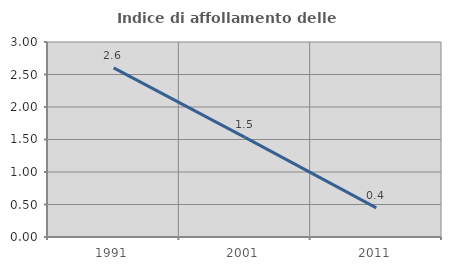
| Category | Indice di affollamento delle abitazioni  |
|---|---|
| 1991.0 | 2.603 |
| 2001.0 | 1.533 |
| 2011.0 | 0.448 |